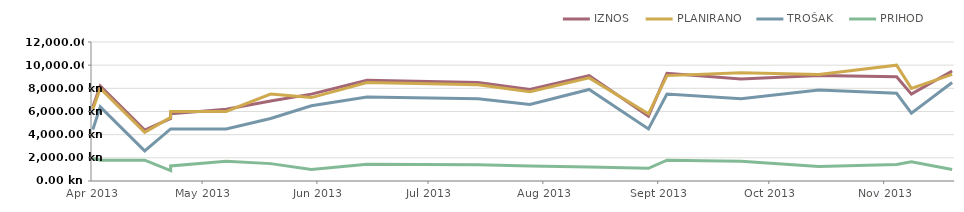
| Category | IZNOS | PLANIRANO | TROŠAK | PRIHOD |
|---|---|---|---|---|
| 2013-04-23 | 6400 | 6200 | 4450 | 1950 |
| 2013-04-25 | 8200 | 8000 | 6400 | 1800 |
| 2013-05-07 | 4400 | 4200 | 2600 | 1800 |
| 2013-05-14 | 5400 | 5500 | 4500 | 900 |
| 2013-05-14 | 5800 | 6000 | 4500 | 1300 |
| 2013-05-29 | 6200 | 6000 | 4500 | 1700 |
| 2013-06-10 | 6900 | 7500 | 5400 | 1500 |
| 2013-06-21 | 7500 | 7200 | 6500 | 1000 |
| 2013-07-06 | 8700 | 8500 | 7250 | 1450 |
| 2013-08-05 | 8500 | 8300 | 7100 | 1400 |
| 2013-08-19 | 7900 | 7700 | 6600 | 1300 |
| 2013-09-04 | 9100 | 8900 | 7900 | 1200 |
| 2013-09-20 | 5600 | 5800 | 4500 | 1100 |
| 2013-09-25 | 9300 | 9100 | 7500 | 1800 |
| 2013-10-15 | 8800 | 9350 | 7100 | 1700 |
| 2013-11-05 | 9100 | 9200 | 7850 | 1250 |
| 2013-11-26 | 9000 | 10000 | 7575 | 1425 |
| 2013-11-30 | 7500 | 8000 | 5850 | 1650 |
| 2013-12-11 | 9500 | 9200 | 8500 | 1000 |